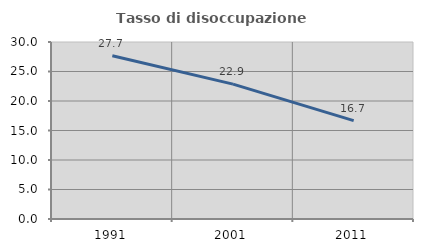
| Category | Tasso di disoccupazione giovanile  |
|---|---|
| 1991.0 | 27.66 |
| 2001.0 | 22.857 |
| 2011.0 | 16.667 |